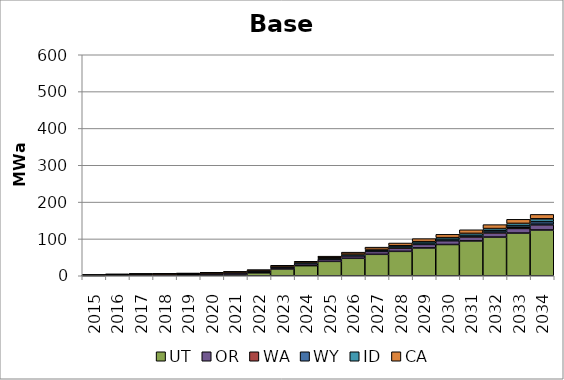
| Category | UT | OR | WA | WY | ID | CA |
|---|---|---|---|---|---|---|
| 2015.0 | 0.689 | 0.522 | 0.006 | 0.015 | 0.034 | 0.666 |
| 2016.0 | 1.791 | 1.213 | 0.015 | 0.04 | 0.08 | 0.742 |
| 2017.0 | 1.906 | 2.047 | 0.015 | 0.042 | 0.1 | 0.831 |
| 2018.0 | 2.01 | 2.442 | 0.016 | 0.052 | 0.132 | 0.932 |
| 2019.0 | 2.525 | 2.923 | 0.026 | 0.089 | 0.216 | 1.115 |
| 2020.0 | 3.318 | 3.543 | 0.046 | 0.135 | 0.424 | 1.317 |
| 2021.0 | 4.361 | 4.485 | 0.085 | 0.217 | 0.65 | 1.625 |
| 2022.0 | 8.015 | 4.831 | 0.236 | 0.477 | 0.916 | 1.963 |
| 2023.0 | 18.462 | 5.193 | 0.314 | 0.634 | 1.262 | 2.569 |
| 2024.0 | 27.405 | 5.554 | 0.412 | 0.779 | 1.756 | 3.436 |
| 2025.0 | 39.073 | 5.931 | 0.531 | 0.963 | 2.224 | 4.45 |
| 2026.0 | 47.413 | 6.814 | 0.654 | 1.135 | 2.735 | 5.305 |
| 2027.0 | 58.223 | 7.814 | 0.838 | 1.331 | 3.301 | 6.196 |
| 2028.0 | 66.275 | 8.988 | 0.984 | 1.494 | 3.844 | 7.294 |
| 2029.0 | 75.494 | 9.589 | 1.122 | 1.8 | 4.532 | 8.222 |
| 2030.0 | 84.873 | 10.25 | 1.261 | 2.006 | 5.095 | 8.978 |
| 2031.0 | 94.549 | 10.829 | 1.414 | 2.604 | 5.638 | 9.802 |
| 2032.0 | 104.93 | 11.383 | 1.566 | 4.067 | 6.203 | 10.672 |
| 2033.0 | 115.821 | 12.695 | 1.706 | 5.122 | 6.736 | 11.163 |
| 2034.0 | 124.202 | 14.02 | 1.871 | 6.818 | 7.629 | 12.022 |